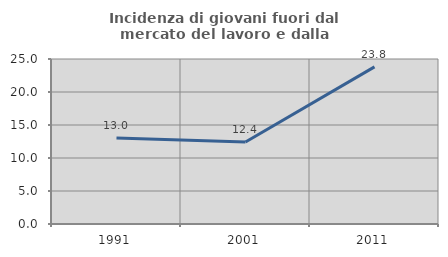
| Category | Incidenza di giovani fuori dal mercato del lavoro e dalla formazione  |
|---|---|
| 1991.0 | 13.043 |
| 2001.0 | 12.422 |
| 2011.0 | 23.81 |